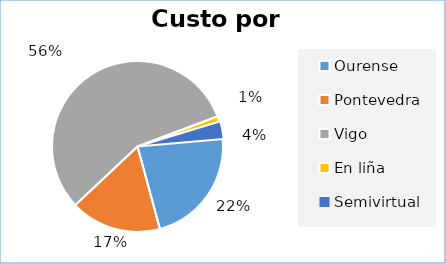
| Category | Series 0 |
|---|---|
| Ourense | 13062 |
| Pontevedra | 10139 |
| Vigo | 33183 |
| En liña | 595 |
| Semivirtual | 1965 |